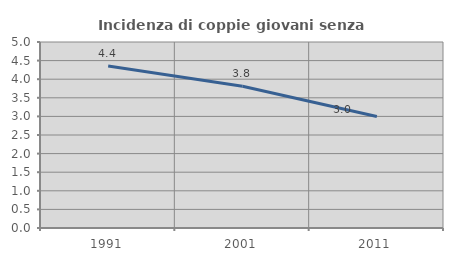
| Category | Incidenza di coppie giovani senza figli |
|---|---|
| 1991.0 | 4.354 |
| 2001.0 | 3.809 |
| 2011.0 | 2.999 |